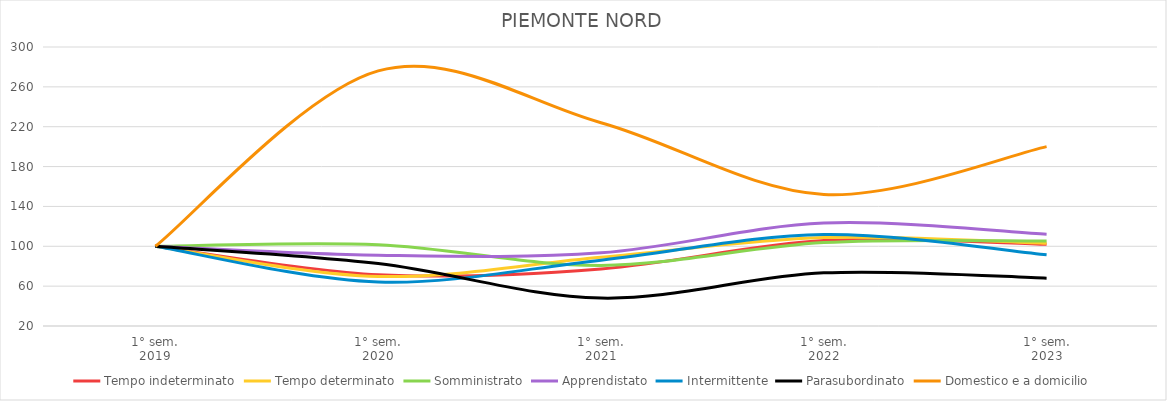
| Category | Tempo indeterminato | Tempo determinato | Somministrato | Apprendistato | Intermittente | Parasubordinato | Domestico e a domicilio |
|---|---|---|---|---|---|---|---|
| 1° sem.
2019 | 100 | 100 | 100 | 100 | 100 | 100 | 100 |
| 1° sem.
2020 | 71.457 | 69.728 | 101.643 | 90.959 | 64.151 | 82.667 | 276 |
| 1° sem.
2021 | 77.322 | 89.001 | 80.832 | 93.425 | 86.085 | 48 | 224 |
| 1° sem.
2022 | 105.767 | 108.745 | 103.724 | 123.288 | 111.792 | 73.333 | 152 |
| 1° sem.
2023 | 102.053 | 103.162 | 105.367 | 112.055 | 91.509 | 68 | 200 |